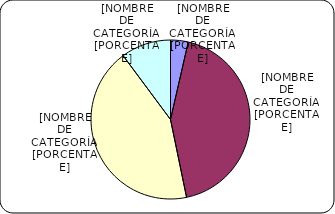
| Category | Series 0 |
|---|---|
| Menores de 3% | 445.3 |
| Entre 3% y 6% | 5357.5 |
| Entre 6% y 8% | 5346.7 |
| Entre 8% y 9% | 1261.2 |